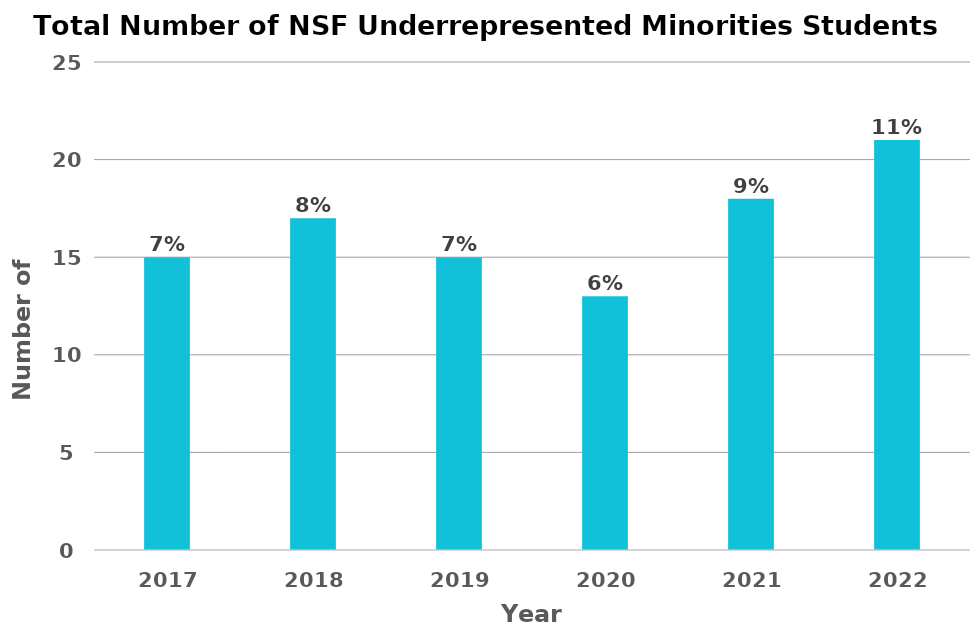
| Category | NSF Underrepresented Group |
|---|---|
| 2017.0 | 15 |
| 2018.0 | 17 |
| 2019.0 | 15 |
| 2020.0 | 13 |
| 2021.0 | 18 |
| 2022.0 | 21 |